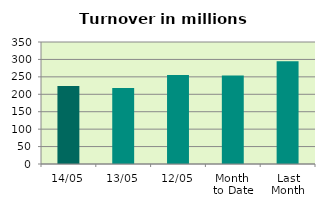
| Category | Series 0 |
|---|---|
| 14/05 | 224.082 |
| 13/05 | 217.829 |
| 12/05 | 255.449 |
| Month 
to Date | 253.949 |
| Last
Month | 294.539 |